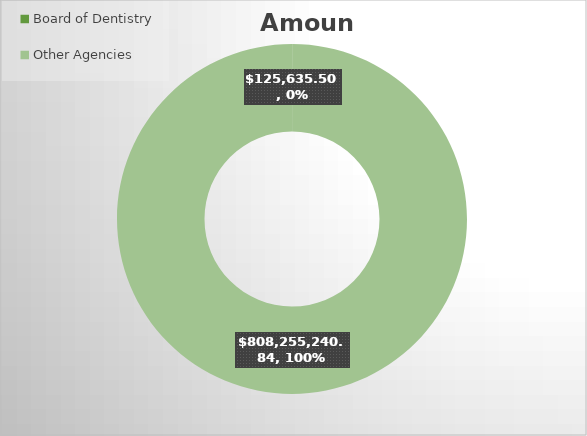
| Category | Amount |
|---|---|
| Board of Dentistry | 125635.5 |
| Other Agencies | 808255240.84 |